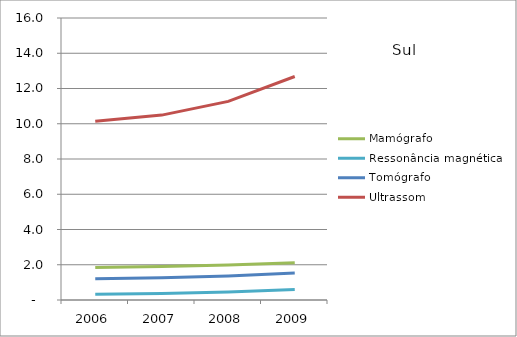
| Category | Mamógrafo | Ressonância magnética | Tomógrafo | Ultrassom |
|---|---|---|---|---|
| 2006.0 | 1.85 | 0.33 | 1.21 | 10.14 |
| 2007.0 | 1.9 | 0.37 | 1.26 | 10.49 |
| 2008.0 | 1.99 | 0.45 | 1.36 | 11.27 |
| 2009.0 | 2.11 | 0.59 | 1.53 | 12.68 |